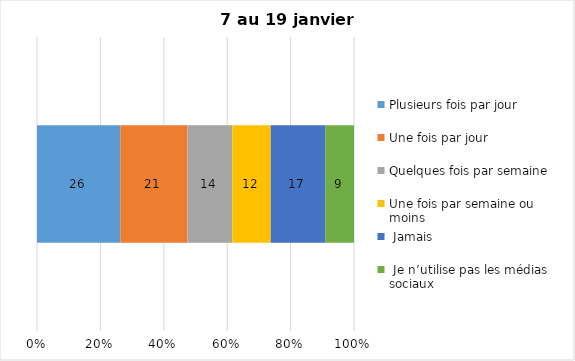
| Category | Plusieurs fois par jour | Une fois par jour | Quelques fois par semaine   | Une fois par semaine ou moins   |  Jamais   |  Je n’utilise pas les médias sociaux |
|---|---|---|---|---|---|---|
| 0 | 26 | 21 | 14 | 12 | 17 | 9 |